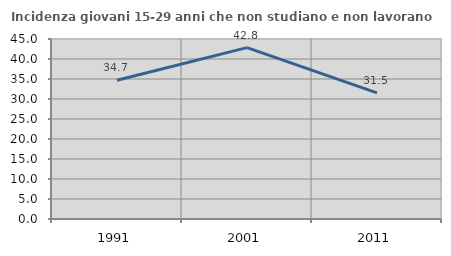
| Category | Incidenza giovani 15-29 anni che non studiano e non lavorano  |
|---|---|
| 1991.0 | 34.694 |
| 2001.0 | 42.835 |
| 2011.0 | 31.545 |